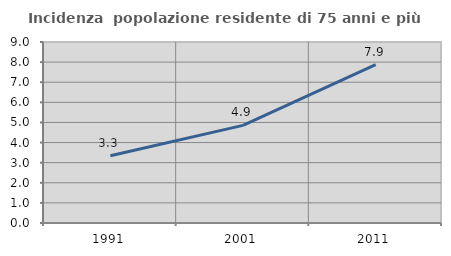
| Category | Incidenza  popolazione residente di 75 anni e più |
|---|---|
| 1991.0 | 3.34 |
| 2001.0 | 4.855 |
| 2011.0 | 7.875 |